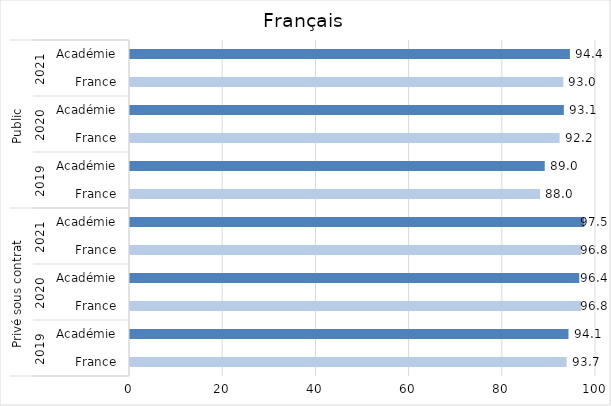
| Category | Français |
|---|---|
| 0 | 93.7 |
| 1 | 94.1 |
| 2 | 96.8 |
| 3 | 96.4 |
| 4 | 96.8 |
| 5 | 97.5 |
| 6 | 88 |
| 7 | 89 |
| 8 | 92.2 |
| 9 | 93.1 |
| 10 | 93 |
| 11 | 94.4 |